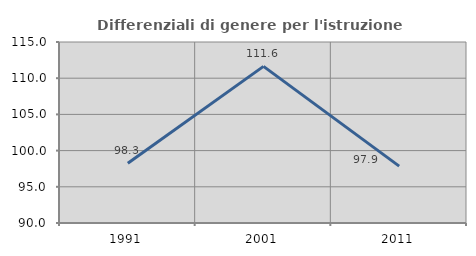
| Category | Differenziali di genere per l'istruzione superiore |
|---|---|
| 1991.0 | 98.251 |
| 2001.0 | 111.636 |
| 2011.0 | 97.855 |